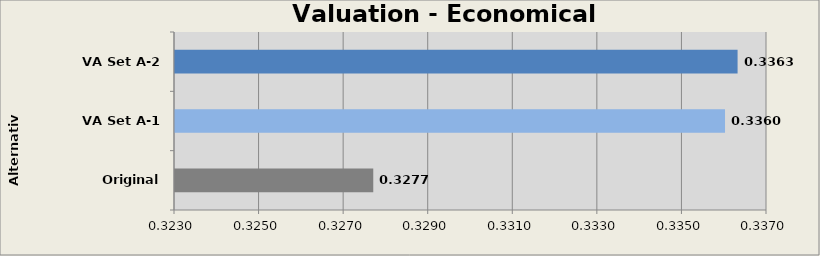
| Category | Economical Module |
|---|---|
| Original A-0 | 0.328 |
| VA Set A-1 | 0.336 |
| VA Set A-2 | 0.336 |